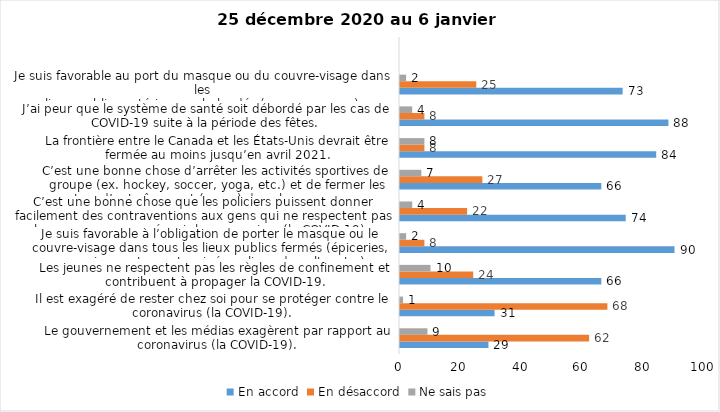
| Category | En accord | En désaccord | Ne sais pas |
|---|---|---|---|
| Le gouvernement et les médias exagèrent par rapport au coronavirus (la COVID-19). | 29 | 62 | 9 |
| Il est exagéré de rester chez soi pour se protéger contre le coronavirus (la COVID-19). | 31 | 68 | 1 |
| Les jeunes ne respectent pas les règles de confinement et contribuent à propager la COVID-19. | 66 | 24 | 10 |
| Je suis favorable à l’obligation de porter le masque ou le couvre-visage dans tous les lieux publics fermés (épiceries, magasins, restaurants, cinéma, lieux de culte, etc.). | 90 | 8 | 2 |
| C’est une bonne chose que les policiers puissent donner facilement des contraventions aux gens qui ne respectent pas les mesures pour prévenir le coronavirus (la COVID-19). | 74 | 22 | 4 |
| C’est une bonne chose d’arrêter les activités sportives de groupe (ex. hockey, soccer, yoga, etc.) et de fermer les centres d’entraînement (gyms) dans les zones rouges. | 66 | 27 | 7 |
| La frontière entre le Canada et les États-Unis devrait être fermée au moins jusqu’en avril 2021. | 84 | 8 | 8 |
| J’ai peur que le système de santé soit débordé par les cas de COVID-19 suite à la période des fêtes. | 88 | 8 | 4 |
| Je suis favorable au port du masque ou du couvre-visage dans les
lieux publics extérieurs achalandés (ex. rues, parcs) | 73 | 25 | 2 |